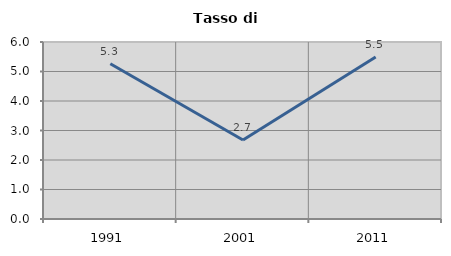
| Category | Tasso di disoccupazione   |
|---|---|
| 1991.0 | 5.263 |
| 2001.0 | 2.679 |
| 2011.0 | 5.495 |